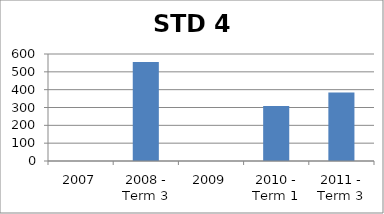
| Category | Score |
|---|---|
| 2007 | 0 |
| 2008 - Term 3 | 555.68 |
| 2009 | 0 |
| 2010 - Term 1 | 308.75 |
| 2011 - Term 3 | 383.71 |